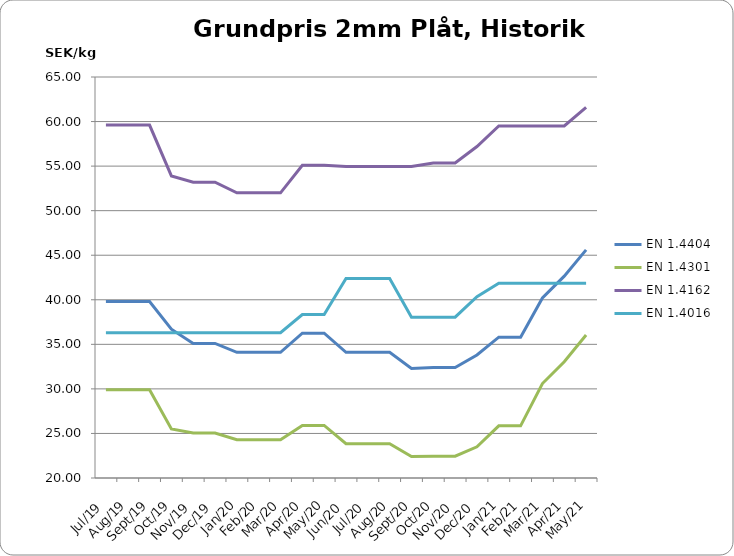
| Category | EN 1.4404 | EN 1.4301 | EN 1.4162  | EN 1.4016 |
|---|---|---|---|---|
| 2019-07-15 | 39.8 | 29.9 | 59.6 | 36.29 |
| 2019-08-15 | 39.8 | 29.9 | 59.6 | 36.29 |
| 2019-09-15 | 39.8 | 29.9 | 59.6 | 36.29 |
| 2019-10-15 | 36.7 | 25.5 | 53.9 | 36.3 |
| 2019-11-15 | 35.1 | 25.05 | 53.2 | 36.3 |
| 2019-12-15 | 35.1 | 25.05 | 53.2 | 36.3 |
| 2020-01-15 | 34.1 | 24.3 | 52 | 36.3 |
| 2020-02-15 | 34.1 | 24.3 | 52 | 36.3 |
| 2020-03-15 | 34.1 | 24.3 | 52 | 36.3 |
| 2020-04-26 | 36.25 | 25.9 | 55.1 | 38.35 |
| 2020-05-26 | 36.25 | 25.9 | 55.1 | 38.35 |
| 2020-06-26 | 34.1 | 23.85 | 54.95 | 42.4 |
| 2020-07-26 | 34.1 | 23.85 | 54.95 | 42.4 |
| 2020-08-26 | 34.1 | 23.85 | 54.95 | 42.4 |
| 2020-09-26 | 32.3 | 22.4 | 54.95 | 38.05 |
| 2020-10-26 | 32.4 | 22.45 | 55.35 | 38.05 |
| 2020-11-26 | 32.4 | 22.45 | 55.35 | 38.05 |
| 2020-12-26 | 33.8 | 23.5 | 57.2 | 40.35 |
| 2021-01-26 | 35.8 | 25.85 | 59.5 | 41.85 |
| 2021-02-26 | 35.8 | 25.85 | 59.5 | 41.85 |
| 2021-03-26 | 40.2 | 30.6 | 59.5 | 41.85 |
| 2021-04-26 | 42.65 | 33.05 | 59.5 | 41.85 |
| 2021-05-26 | 45.6 | 36.05 | 61.6 | 41.85 |